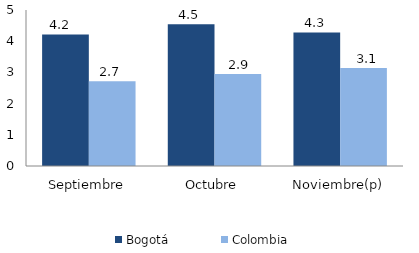
| Category | Bogotá | Colombia |
|---|---|---|
| Septiembre | 4.216 | 2.716 |
| Octubre | 4.545 | 2.946 |
| Noviembre(p) | 4.28 | 3.142 |